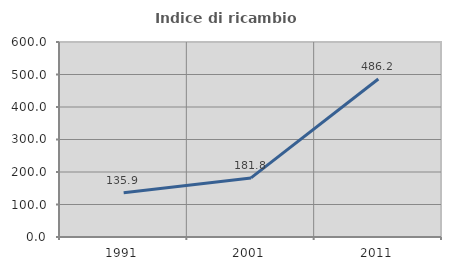
| Category | Indice di ricambio occupazionale  |
|---|---|
| 1991.0 | 135.938 |
| 2001.0 | 181.818 |
| 2011.0 | 486.207 |